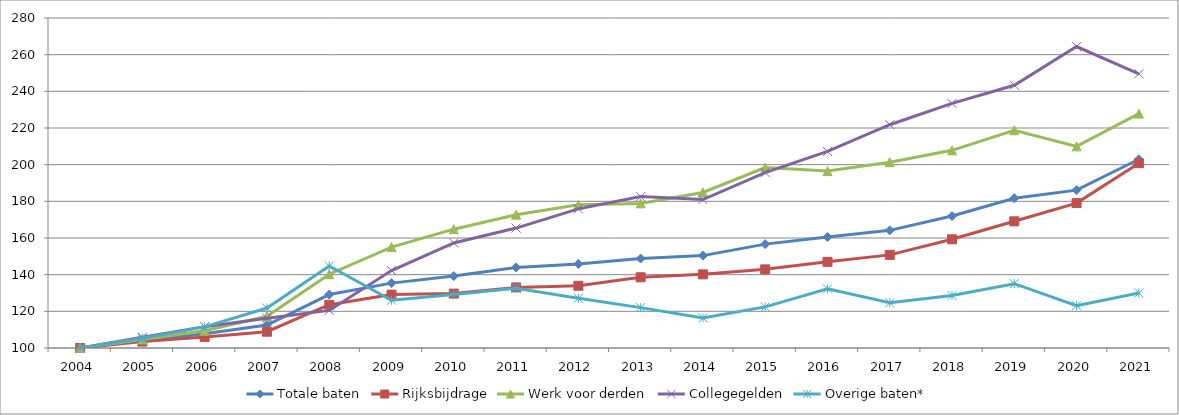
| Category | Totale baten | Rijksbijdrage | Werk voor derden | Collegegelden | Overige baten* |
|---|---|---|---|---|---|
| 2004.0 | 100 | 100 | 100 | 100 | 100 |
| 2005.0 | 104.092 | 103.499 | 104.629 | 105.881 | 105.274 |
| 2006.0 | 107.725 | 106.046 | 109.4 | 111.65 | 111.532 |
| 2007.0 | 112.54 | 108.881 | 117.297 | 116.238 | 121.792 |
| 2008.0 | 129.159 | 123.607 | 140.241 | 120.507 | 144.7 |
| 2009.0 | 135.394 | 129.117 | 155.052 | 142.268 | 126.04 |
| 2010.0 | 139.236 | 129.673 | 164.812 | 157.305 | 129.194 |
| 2011.0 | 143.936 | 133.048 | 172.718 | 165.412 | 132.613 |
| 2012.0 | 145.837 | 133.95 | 178.088 | 175.878 | 127.131 |
| 2013.0 | 148.786 | 138.576 | 178.882 | 182.576 | 122.028 |
| 2014.0 | 150.389 | 140.17 | 184.857 | 180.975 | 116.442 |
| 2015.0 | 156.657 | 142.9 | 198.435 | 195.707 | 122.426 |
| 2016.0 | 160.529 | 146.987 | 196.5 | 207.207 | 132.276 |
| 2017.0 | 164.164 | 150.797 | 201.356 | 221.776 | 124.656 |
| 2018.0 | 171.97 | 159.3 | 207.813 | 233.423 | 128.682 |
| 2019.0 | 181.715 | 169.102 | 218.77 | 243.315 | 135.073 |
| 2020.0 | 186.11 | 179.038 | 209.981 | 264.447 | 123.084 |
| 2021.0 | 202.971 | 200.812 | 227.875 | 249.578 | 129.992 |